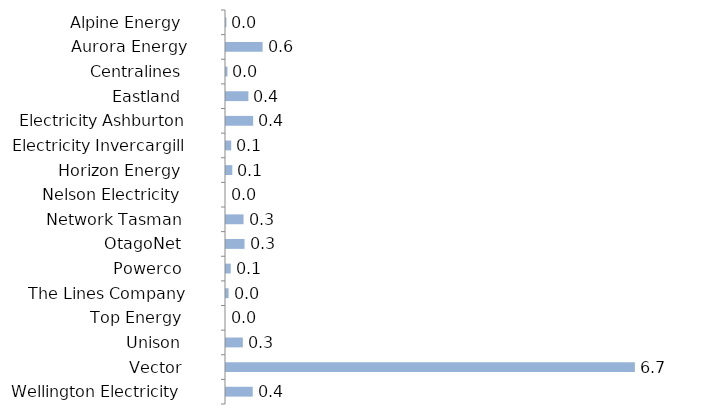
| Category | Series 0 |
|---|---|
| Alpine Energy  | 0.006 |
| Aurora Energy | 0.601 |
| Centralines  | 0.024 |
| Eastland  | 0.368 |
| Electricity Ashburton | 0.446 |
| Electricity Invercargill | 0.085 |
| Horizon Energy  | 0.103 |
| Nelson Electricity  | 0 |
| Network Tasman  | 0.288 |
| OtagoNet  | 0.304 |
| Powerco  | 0.078 |
| The Lines Company | 0.043 |
| Top Energy  | 0 |
| Unison  | 0.277 |
| Vector  | 6.717 |
| Wellington Electricity  | 0.439 |